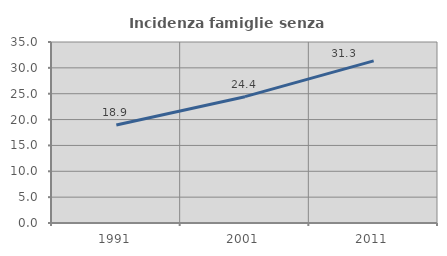
| Category | Incidenza famiglie senza nuclei |
|---|---|
| 1991.0 | 18.95 |
| 2001.0 | 24.43 |
| 2011.0 | 31.34 |